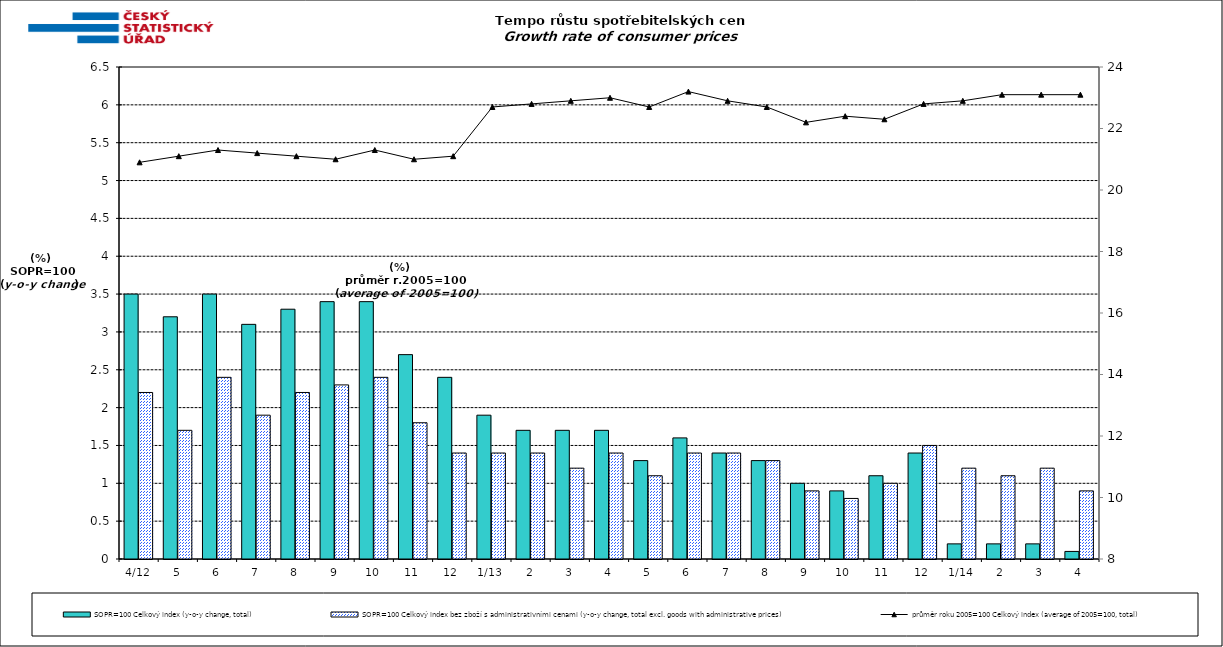
| Category | SOPR=100 Celkový index (y-o-y change, total) | SOPR=100 Celkový index bez zboží s administrativními cenami (y-o-y change, total excl. goods with administrative prices)  |
|---|---|---|
| 4/12 | 3.5 | 2.2 |
| 5 | 3.2 | 1.7 |
| 6 | 3.5 | 2.4 |
| 7 | 3.1 | 1.9 |
| 8 | 3.3 | 2.2 |
| 9 | 3.4 | 2.3 |
| 10 | 3.4 | 2.4 |
| 11 | 2.7 | 1.8 |
| 12 | 2.4 | 1.4 |
| 1/13 | 1.9 | 1.4 |
| 2 | 1.7 | 1.4 |
| 3 | 1.7 | 1.2 |
| 4 | 1.7 | 1.4 |
| 5 | 1.3 | 1.1 |
| 6 | 1.6 | 1.4 |
| 7 | 1.4 | 1.4 |
| 8 | 1.3 | 1.3 |
| 9 | 1 | 0.9 |
| 10 | 0.9 | 0.8 |
| 11 | 1.1 | 1 |
| 12 | 1.4 | 1.5 |
| 1/14 | 0.2 | 1.2 |
| 2 | 0.2 | 1.1 |
| 3 | 0.2 | 1.2 |
| 4 | 0.1 | 0.9 |